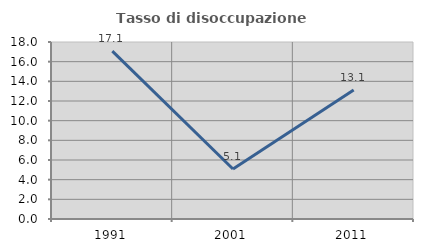
| Category | Tasso di disoccupazione giovanile  |
|---|---|
| 1991.0 | 17.073 |
| 2001.0 | 5.085 |
| 2011.0 | 13.115 |